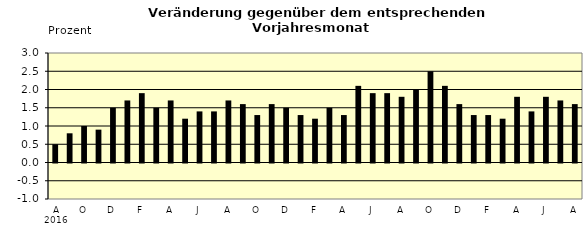
| Category | Series 0 |
|---|---|
| 0 | 0.5 |
| 1 | 0.8 |
| 2 | 1 |
| 3 | 0.9 |
| 4 | 1.5 |
| 5 | 1.7 |
| 6 | 1.9 |
| 7 | 1.5 |
| 8 | 1.7 |
| 9 | 1.2 |
| 10 | 1.4 |
| 11 | 1.4 |
| 12 | 1.7 |
| 13 | 1.6 |
| 14 | 1.3 |
| 15 | 1.6 |
| 16 | 1.5 |
| 17 | 1.3 |
| 18 | 1.2 |
| 19 | 1.5 |
| 20 | 1.3 |
| 21 | 2.1 |
| 22 | 1.9 |
| 23 | 1.9 |
| 24 | 1.8 |
| 25 | 2 |
| 26 | 2.5 |
| 27 | 2.1 |
| 28 | 1.6 |
| 29 | 1.3 |
| 30 | 1.3 |
| 31 | 1.2 |
| 32 | 1.8 |
| 33 | 1.4 |
| 34 | 1.8 |
| 35 | 1.7 |
| 36 | 1.6 |